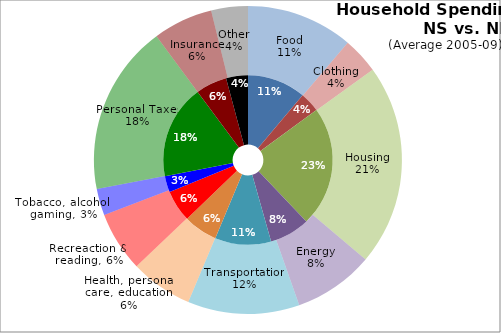
| Category | NS | NB |
|---|---|---|
| Food | 6520.4 | 6384.6 |
| Clothing | 2232.2 | 2167 |
| Housing | 13410.6 | 12046.6 |
| Energy | 4495.4 | 4799.2 |
| Transportation | 6259.2 | 6683.2 |
| Health, personal care, education | 3785.2 | 3728 |
| Recreaction & reading | 3526 | 3583.2 |
| Tobacco, alcohol, gaming | 1812.2 | 1591.2 |
| Personal Taxes | 10497 | 10190.8 |
| Insurance | 3483.6 | 3573.8 |
| Other | 2438.4 | 2192.6 |